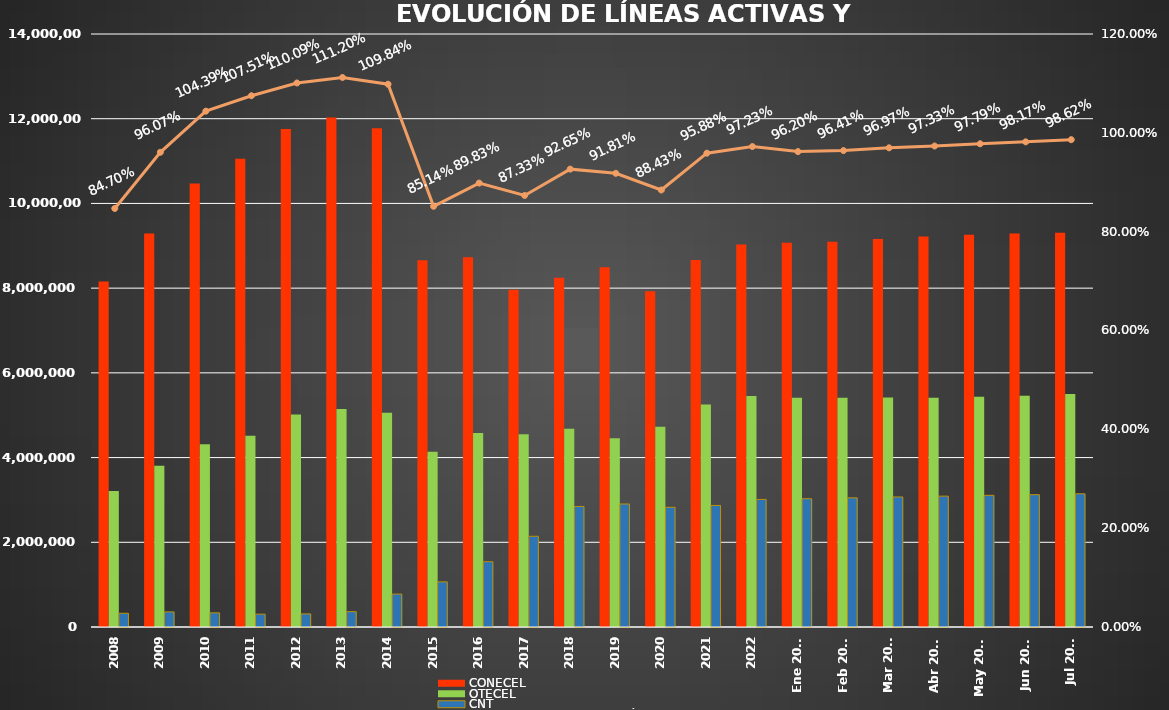
| Category | CONECEL | OTECEL | CNT |
|---|---|---|---|
| 2008 | 8156359 | 3211922 | 323967 |
| 2009 | 9291268 | 3806432 | 356900 |
| 2010 | 10470502 | 4314599 | 333730 |
| 2011 | 11057316 | 4513874 | 303368 |
| 2012 | 11757906 | 5019686 | 309271 |
| 2013 | 12030886 | 5148308 | 362560 |
| 2014 | 11772020 | 5055645 | 776892 |
| 2015 | 8658619 | 4134698 | 1065703 |
| 2016 | 8726823 | 4580092 | 1541219 |
| 2017 | 7960263 | 4549024 | 2142117 |
| 2018 | 8248050 | 4679646 | 2845142 |
| 2019 | 8493054 | 4456356 | 2903690 |
| 2020 | 7929253 | 4729725 | 2826388 |
| 2021 | 8665715 | 5254468 | 2869417 |
| 2022 | 9027737 | 5451115 | 3011899 |
| Ene 2023 | 9073421 | 5411860 | 3028254 |
| Feb 2023 | 9092490 | 5410682 | 3048837 |
| Mar 2023 | 9162562 | 5419670 | 3070611 |
| Abr 2023 | 9220042 | 5409581 | 3089410 |
| May 2023 | 9259499 | 5434175 | 3108405 |
| Jun 2023 | 9290231 | 5458655 | 3123905 |
| Jul 2023 | 9310350 | 5499232 | 3144067 |